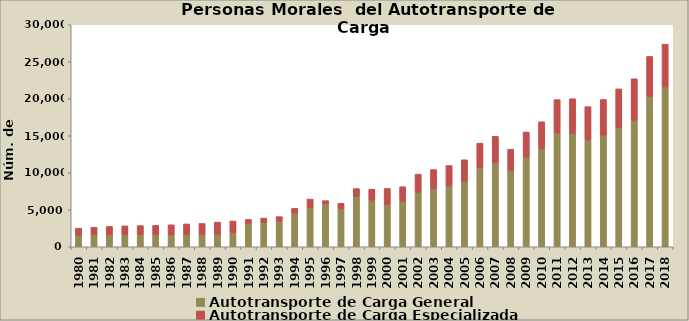
| Category | Autotransporte de Carga General | Autotransporte de Carga Especializada |
|---|---|---|
| 1980.0 | 1569 | 949 |
| 1981.0 | 1596 | 1046 |
| 1982.0 | 1602 | 1150 |
| 1983.0 | 1627 | 1200 |
| 1984.0 | 1626 | 1239 |
| 1985.0 | 1606 | 1289 |
| 1986.0 | 1609 | 1366 |
| 1987.0 | 1631 | 1456 |
| 1988.0 | 1633 | 1516 |
| 1989.0 | 1662 | 1675 |
| 1990.0 | 1892 | 1590 |
| 1991.0 | 3137 | 563 |
| 1992.0 | 3290 | 590 |
| 1993.0 | 3459 | 617 |
| 1994.0 | 4545 | 642 |
| 1995.0 | 5278 | 1171 |
| 1996.0 | 5841 | 398 |
| 1997.0 | 5107 | 776 |
| 1998.0 | 6812 | 1052 |
| 1999.0 | 6297 | 1486 |
| 2000.0 | 5669 | 2211 |
| 2001.0 | 6101 | 2017 |
| 2002.0 | 7351 | 2459 |
| 2003.0 | 7805 | 2627 |
| 2004.0 | 8202 | 2776 |
| 2005.0 | 8815 | 2943 |
| 2006.0 | 10632 | 3366 |
| 2007.0 | 11373 | 3550 |
| 2008.0 | 10287 | 2894 |
| 2009.0 | 12098 | 3412 |
| 2010.0 | 13210 | 3682 |
| 2011.0 | 15370 | 4517 |
| 2012.0 | 15298 | 4716 |
| 2013.0 | 14416 | 4521 |
| 2014.0 | 15084 | 4819 |
| 2015.0 | 16109 | 5228 |
| 2016.0 | 17082 | 5622 |
| 2017.0 | 20319 | 5401 |
| 2018.0 | 21582 | 5792 |